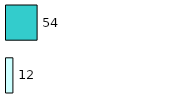
| Category | Series 0 | Series 1 |
|---|---|---|
| 0 | 12 | 54 |